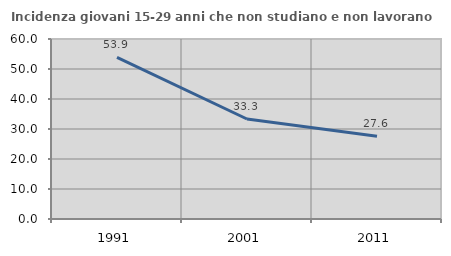
| Category | Incidenza giovani 15-29 anni che non studiano e non lavorano  |
|---|---|
| 1991.0 | 53.876 |
| 2001.0 | 33.333 |
| 2011.0 | 27.619 |